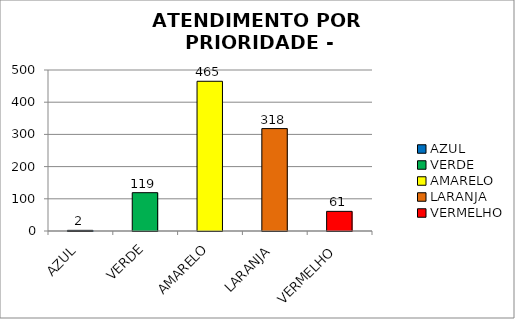
| Category | Total Regional: |
|---|---|
| AZUL | 2 |
| VERDE | 119 |
| AMARELO | 465 |
| LARANJA | 318 |
| VERMELHO | 61 |